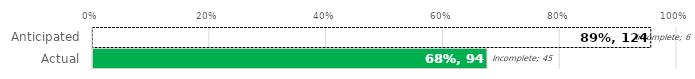
| Category | Complete | Incomplete |
|---|---|---|
| Anticipated | 133 | 6 |
| Actual | 94 | 45 |